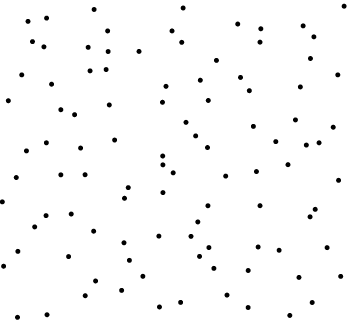
| Category | Series 0 |
|---|---|
| 0.0507411781989947 | 0.008 |
| 0.136259834543219 | 0.016 |
| 0.24705375270722 | 0.076 |
| 0.352571284057487 | 0.093 |
| 0.462213919387346 | 0.041 |
| 0.523549819992062 | 0.055 |
| 0.657953081417749 | 0.078 |
| 0.719189159757899 | 0.039 |
| 0.840012931317837 | 0.014 |
| 0.904935629043919 | 0.055 |
| 0.0104515715090013 | 0.168 |
| 0.198827544595943 | 0.198 |
| 0.27701335511885 | 0.122 |
| 0.375105556218036 | 0.186 |
| 0.414151638826648 | 0.136 |
| 0.578380734657089 | 0.199 |
| 0.619971730847848 | 0.161 |
| 0.719422454723605 | 0.155 |
| 0.866587919905056 | 0.133 |
| 0.987561196890335 | 0.136 |
| 0.0518083769255997 | 0.214 |
| 0.100603873545051 | 0.291 |
| 0.271508206421539 | 0.277 |
| 0.359398896232051 | 0.241 |
| 0.460456066488599 | 0.262 |
| 0.55361697315056 | 0.261 |
| 0.605549712060858 | 0.226 |
| 0.748239818957164 | 0.228 |
| 0.809021410247585 | 0.218 |
| 0.948155776641427 | 0.226 |
| 0.00664562782820999 | 0.369 |
| 0.133458402872907 | 0.326 |
| 0.206419994534225 | 0.331 |
| 0.360897733541255 | 0.38 |
| 0.472383358973736 | 0.398 |
| 0.573359412547806 | 0.306 |
| 0.602736144217073 | 0.357 |
| 0.753757059474251 | 0.357 |
| 0.898741928995196 | 0.322 |
| 0.913671919066975 | 0.346 |
| 0.0471582276819487 | 0.445 |
| 0.176368734116421 | 0.454 |
| 0.24659625520476 | 0.454 |
| 0.371770524860955 | 0.414 |
| 0.472184738435326 | 0.485 |
| 0.502039050561397 | 0.46 |
| 0.654184798378653 | 0.45 |
| 0.743342089304275 | 0.464 |
| 0.834745335381673 | 0.485 |
| 0.981355676582095 | 0.436 |
| 0.0767196278053534 | 0.528 |
| 0.134435485522485 | 0.554 |
| 0.233614494334418 | 0.537 |
| 0.332257058779593 | 0.562 |
| 0.471678245739434 | 0.512 |
| 0.567204688640024 | 0.575 |
| 0.601478764708459 | 0.539 |
| 0.799382239619281 | 0.557 |
| 0.887900011215165 | 0.547 |
| 0.924808911753561 | 0.554 |
| 0.0241458259769384 | 0.685 |
| 0.17637580679702 | 0.657 |
| 0.216222559706298 | 0.642 |
| 0.316797385852779 | 0.672 |
| 0.470964230488179 | 0.68 |
| 0.53910830148513 | 0.618 |
| 0.603714063143722 | 0.686 |
| 0.734468160321542 | 0.605 |
| 0.856416313474162 | 0.625 |
| 0.965881373742261 | 0.602 |
| 0.063017424512147 | 0.766 |
| 0.149471628516007 | 0.737 |
| 0.261046229586716 | 0.779 |
| 0.307608397529889 | 0.783 |
| 0.481138199676234 | 0.73 |
| 0.580597817410273 | 0.749 |
| 0.697159088957909 | 0.758 |
| 0.722729171168576 | 0.717 |
| 0.870568765648314 | 0.728 |
| 0.979169019786256 | 0.766 |
| 0.094157356483124 | 0.87 |
| 0.12732429096899 | 0.854 |
| 0.255557314341668 | 0.852 |
| 0.313385082306169 | 0.839 |
| 0.402997697706628 | 0.839 |
| 0.526821125951355 | 0.868 |
| 0.62735123819178 | 0.811 |
| 0.753618549513932 | 0.868 |
| 0.899873432072812 | 0.817 |
| 0.909807418384326 | 0.885 |
| 0.0812103284074391 | 0.933 |
| 0.135041150709749 | 0.943 |
| 0.272756261334872 | 0.97 |
| 0.312067608233627 | 0.903 |
| 0.498623876674957 | 0.903 |
| 0.530862703492915 | 0.975 |
| 0.689119263008361 | 0.925 |
| 0.756027106090229 | 0.91 |
| 0.878689385071894 | 0.919 |
| 0.997413720477864 | 0.981 |